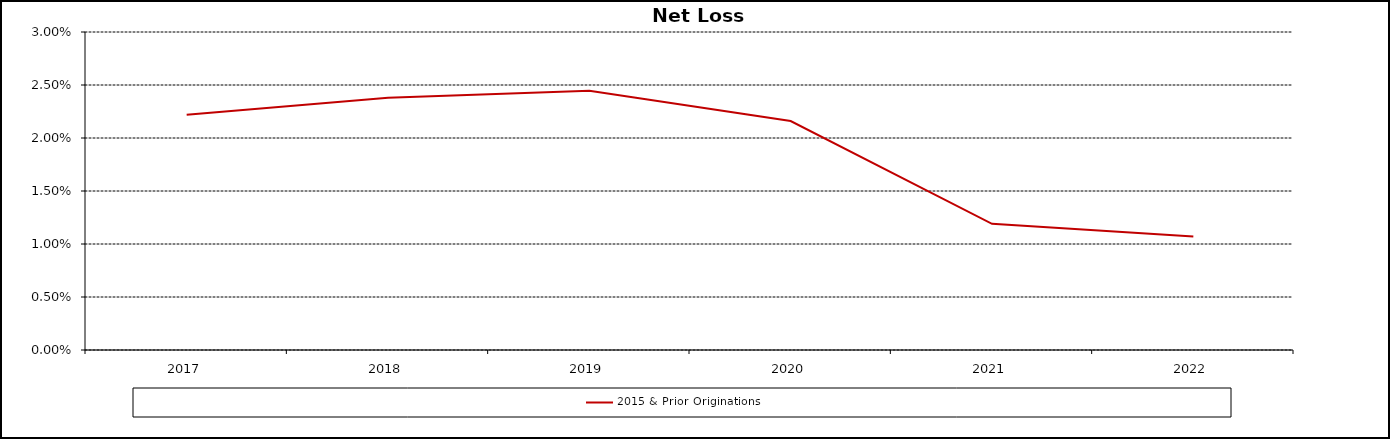
| Category | 2015 & Prior Originations |
|---|---|
| 2017.0 | 0.022 |
| 2018.0 | 0.024 |
| 2019.0 | 0.024 |
| 2020.0 | 0.022 |
| 2021.0 | 0.012 |
| 2022.0 | 0.011 |